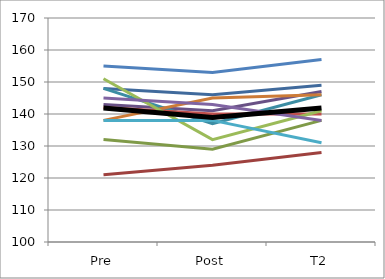
| Category | Series 0 | Series 1 | Series 2 | Series 3 | Series 4 | Series 5 | Series 6 | Series 7 | Series 8 | Series 9 | Series 10 | Mean |
|---|---|---|---|---|---|---|---|---|---|---|---|---|
| Pre | 148 | 121 | 132 | 143 | 148 | 138 | 155 | 142 | 151 | 145 | 138 | 141.909 |
| Post | 146 | 124 | 129 | 141 | 137 | 145 | 153 | 140 | 132 | 143 | 138 | 138.909 |
| T2 | 149 | 128 | 138 | 147 | 146 | 146 | 157 | 140 | 141 | 138 | 131 | 141.909 |